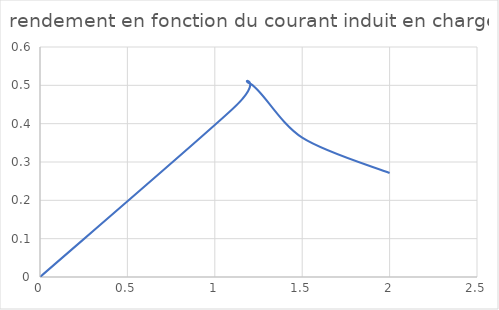
| Category | rendement |
|---|---|
| 0.0 | 0 |
| 1.1 | 0.438 |
| 1.2 | 0.505 |
| 1.5 | 0.364 |
| 2.0 | 0.271 |